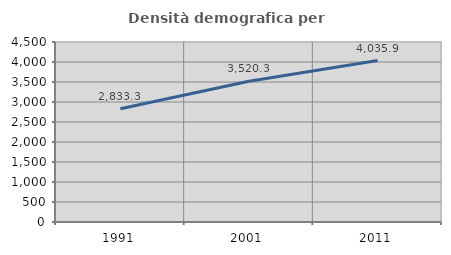
| Category | Densità demografica |
|---|---|
| 1991.0 | 2833.316 |
| 2001.0 | 3520.339 |
| 2011.0 | 4035.867 |